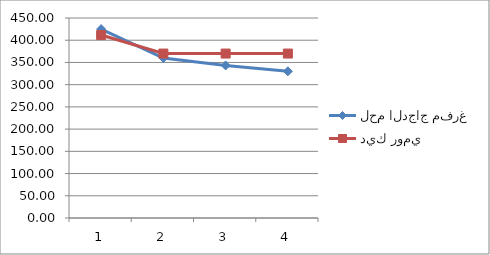
| Category | لحم الدجاج مفرغ | ديك رومي  |
|---|---|---|
| 0 | 425 | 411.67 |
| 1 | 360 | 370 |
| 2 | 343.33 | 370 |
| 3 | 330 | 370 |